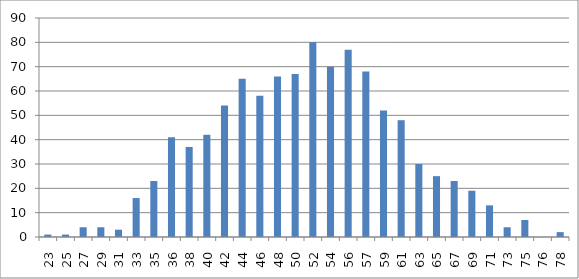
| Category | Series 0 |
|---|---|
| 23.074108501682346 | 1 |
| 24.98159944657811 | 1 |
| 26.88909039147387 | 4 |
| 28.796581336369634 | 4 |
| 30.704072281265397 | 3 |
| 32.61156322616116 | 16 |
| 34.51905417105692 | 23 |
| 36.426545115952685 | 41 |
| 38.33403606084845 | 37 |
| 40.24152700574421 | 42 |
| 42.14901795063997 | 54 |
| 44.056508895535735 | 65 |
| 45.9639998404315 | 58 |
| 47.87149078532726 | 66 |
| 49.77898173022302 | 67 |
| 51.686472675118786 | 80 |
| 53.59396362001455 | 70 |
| 55.50145456491031 | 77 |
| 57.408945509806074 | 68 |
| 59.31643645470184 | 52 |
| 61.2239273995976 | 48 |
| 63.13141834449336 | 30 |
| 65.03890928938912 | 25 |
| 66.9464002342849 | 23 |
| 68.85389117918066 | 19 |
| 70.76138212407643 | 13 |
| 72.6688730689722 | 4 |
| 74.57636401386797 | 7 |
| 76.48385495876374 | 0 |
| 78.39134590365951 | 2 |